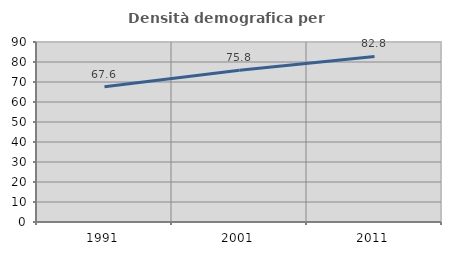
| Category | Densità demografica |
|---|---|
| 1991.0 | 67.572 |
| 2001.0 | 75.827 |
| 2011.0 | 82.755 |